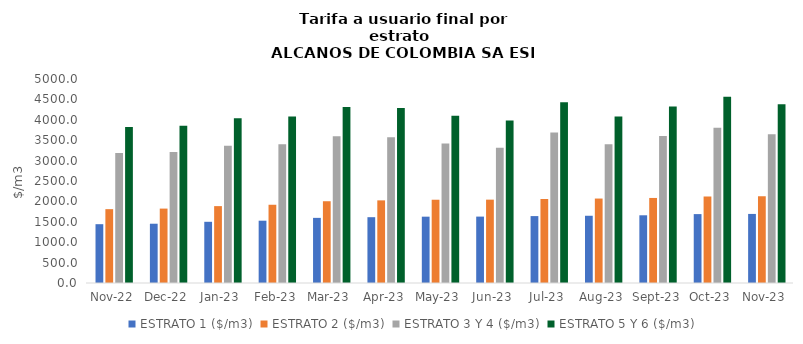
| Category | ESTRATO 1 ($/m3) | ESTRATO 2 ($/m3) | ESTRATO 3 Y 4 ($/m3) | ESTRATO 5 Y 6 ($/m3) |
|---|---|---|---|---|
| 2022-11-01 | 1441.49 | 1809.92 | 3185.9 | 3823.08 |
| 2022-12-01 | 1452.83 | 1823.71 | 3209.93 | 3851.916 |
| 2023-01-01 | 1500.18 | 1884.37 | 3365.49 | 4038.588 |
| 2023-02-01 | 1526.99 | 1917.75 | 3398.26 | 4077.912 |
| 2023-03-01 | 1596.45 | 2004.11 | 3596.1 | 4315.32 |
| 2023-04-01 | 1613.02 | 2025.28 | 3575.22 | 4290.264 |
| 2023-05-01 | 1625.74 | 2040.95 | 3416.65 | 4099.98 |
| 2023-06-01 | 1627.48 | 2042.98 | 3316.57 | 3979.884 |
| 2023-07-01 | 1639.99 | 2059.51 | 3689.81 | 4427.772 |
| 2023-08-01 | 1648.05 | 2069.91 | 3401.48 | 4081.776 |
| 2023-09-01 | 1659.68 | 2084.34 | 3603.59 | 4324.308 |
| 2023-10-01 | 1688.77 | 2120.24 | 3805.44 | 4566.528 |
| 2023-11-01 | 1692.88 | 2125.65 | 3648.51 | 4378.212 |